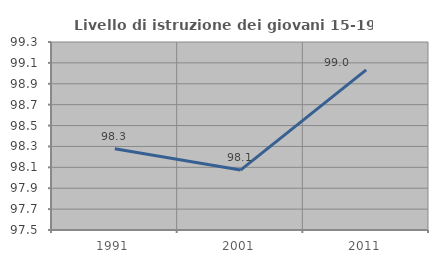
| Category | Livello di istruzione dei giovani 15-19 anni |
|---|---|
| 1991.0 | 98.278 |
| 2001.0 | 98.074 |
| 2011.0 | 99.033 |